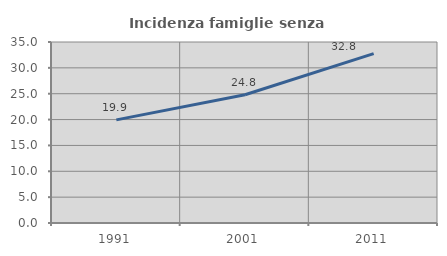
| Category | Incidenza famiglie senza nuclei |
|---|---|
| 1991.0 | 19.944 |
| 2001.0 | 24.804 |
| 2011.0 | 32.755 |